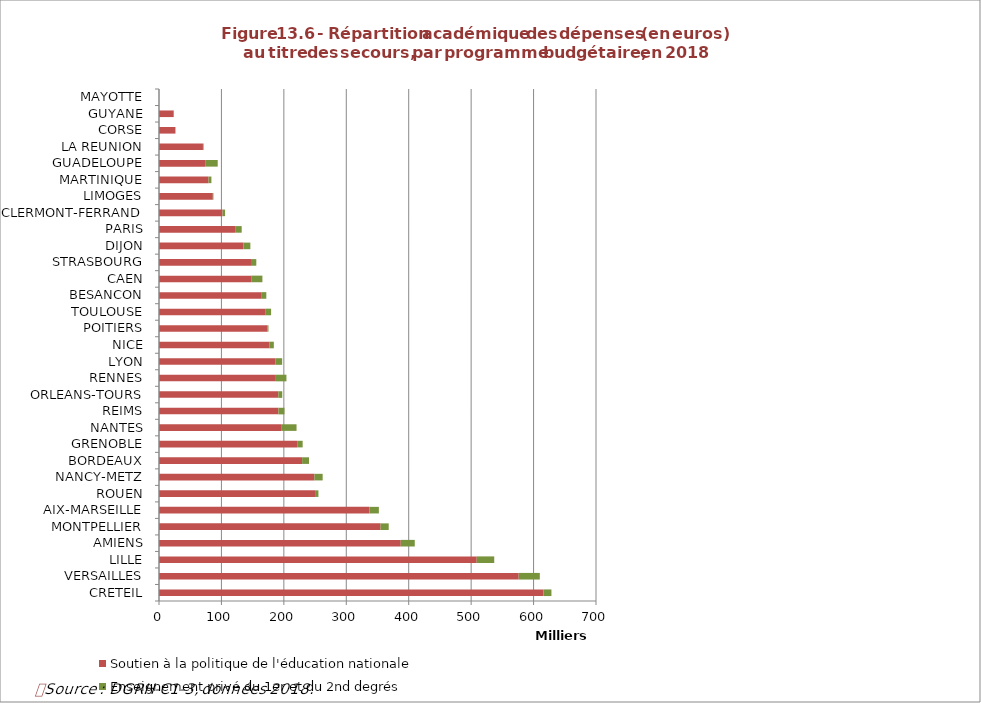
| Category | Soutien à la politique de l'éducation nationale | Enseignement privé du 1er et du 2nd degrés |
|---|---|---|
| CRETEIL | 615789 | 12810 |
| VERSAILLES | 576188 | 33800 |
| LILLE | 508957 | 28020 |
| AMIENS | 387236 | 22450 |
| MONTPELLIER | 354918 | 13050 |
| AIX-MARSEILLE | 336980 | 15200 |
| ROUEN | 249993 | 5400 |
| NANCY-METZ | 248971 | 13200 |
| BORDEAUX | 229247 | 11050 |
| GRENOBLE | 221361 | 8750 |
| NANTES | 195627 | 24693 |
| REIMS | 191310 | 9640 |
| ORLEANS-TOURS | 191169 | 6260 |
| RENNES | 187190 | 16937 |
| LYON | 186846 | 10420 |
| NICE | 176650 | 7300 |
| POITIERS | 173835 | 1500 |
| TOULOUSE | 170966 | 8620 |
| BESANCON | 164600 | 7300 |
| CAEN | 147671 | 17958 |
| STRASBOURG | 147368 | 8500 |
| DIJON | 135373 | 10950 |
| PARIS | 121950 | 10500 |
| CLERMONT-FERRAND | 101819 | 4050 |
| LIMOGES | 86174 | 1000 |
| MARTINIQUE | 79336 | 4610 |
| GUADELOUPE | 73962 | 20100 |
| LA REUNION | 70400 | 1000 |
| CORSE | 26367 | 0 |
| GUYANE | 23400 | 548 |
| MAYOTTE | 0 | 0 |